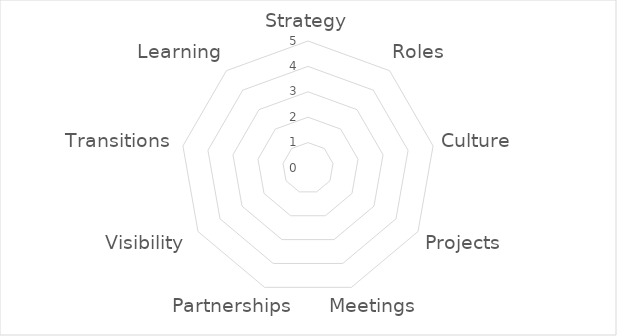
| Category | Series 0 |
|---|---|
| Strategy | 0 |
| Roles | 0 |
| Culture | 0 |
| Projects | 0 |
| Meetings | 0 |
| Partnerships | 0 |
| Visibility | 0 |
| Transitions | 0 |
| Learning | 0 |